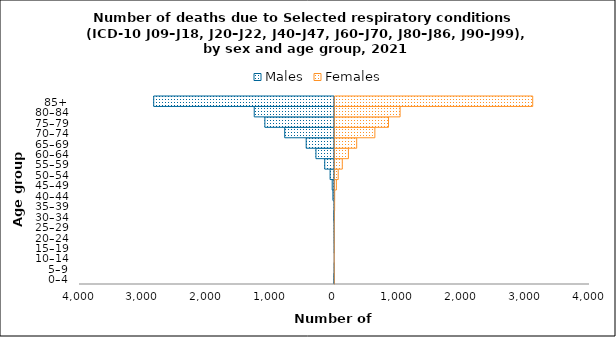
| Category | Males | Females |
|---|---|---|
| 0–4 | -9 | 6 |
| 5–9 | -2 | 3 |
| 10–14 | 0 | 1 |
| 15–19 | -2 | 4 |
| 20–24 | -4 | 2 |
| 25–29 | -6 | 3 |
| 30–34 | -11 | 8 |
| 35–39 | -7 | 10 |
| 40–44 | -25 | 11 |
| 45–49 | -36 | 37 |
| 50–54 | -69 | 66 |
| 55–59 | -153 | 130 |
| 60–64 | -291 | 226 |
| 65–69 | -444 | 356 |
| 70–74 | -781 | 641 |
| 75–79 | -1092 | 855 |
| 80–84 | -1259 | 1037 |
| 85+ | -2836 | 3117 |